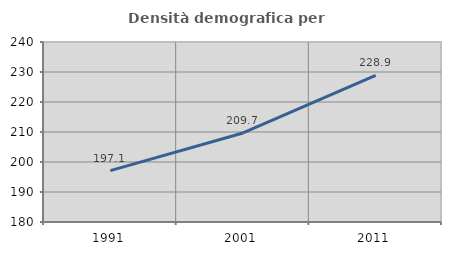
| Category | Densità demografica |
|---|---|
| 1991.0 | 197.113 |
| 2001.0 | 209.673 |
| 2011.0 | 228.885 |